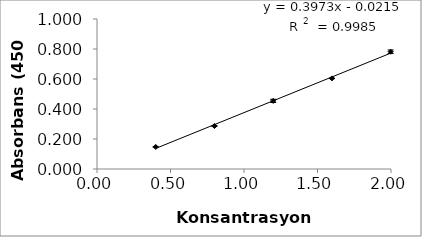
| Category | Series 0 |
|---|---|
| 0.39953653761636504 | 0.147 |
| 0.7990730752327301 | 0.287 |
| 1.198609612849095 | 0.454 |
| 1.5981461504654602 | 0.604 |
| 1.9976826880818253 | 0.782 |